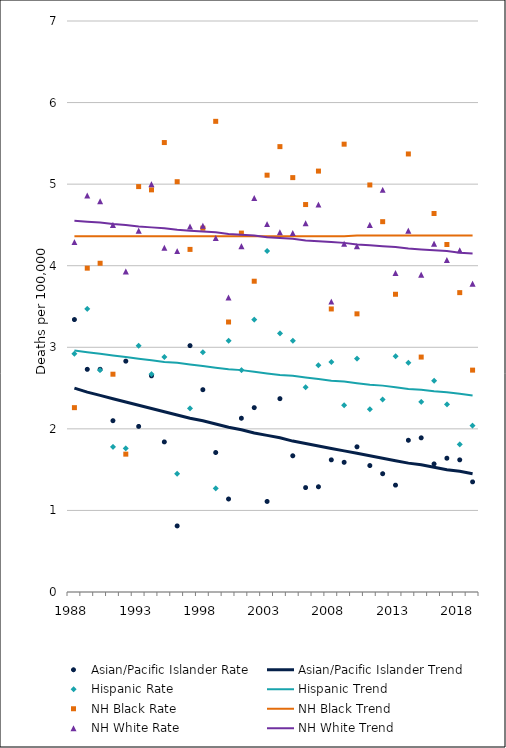
| Category | Asian/Pacific Islander Rate | Asian/Pacific Islander Trend | Hispanic Rate | Hispanic Trend | NH Black Rate | NH Black Trend | NH White Rate | NH White Trend |
|---|---|---|---|---|---|---|---|---|
| 1988.0 | 3.34 | 2.5 | 2.92 | 2.96 | 2.26 | 4.36 | 4.29 | 4.55 |
| 1989.0 | 2.73 | 2.45 | 3.47 | 2.94 | 3.97 | 4.36 | 4.86 | 4.54 |
| 1990.0 | 2.73 | 2.41 | 2.72 | 2.92 | 4.03 | 4.36 | 4.79 | 4.53 |
| 1991.0 | 2.1 | 2.37 | 1.78 | 2.9 | 2.67 | 4.36 | 4.5 | 4.51 |
| 1992.0 | 2.83 | 2.33 | 1.76 | 2.88 | 1.69 | 4.36 | 3.93 | 4.5 |
| 1993.0 | 2.03 | 2.29 | 3.02 | 2.86 | 4.97 | 4.36 | 4.43 | 4.48 |
| 1994.0 | 2.65 | 2.25 | 2.67 | 2.84 | 4.93 | 4.36 | 5 | 4.47 |
| 1995.0 | 1.84 | 2.21 | 2.88 | 2.82 | 5.51 | 4.36 | 4.22 | 4.46 |
| 1996.0 | 0.81 | 2.17 | 1.45 | 2.81 | 5.03 | 4.36 | 4.18 | 4.44 |
| 1997.0 | 3.02 | 2.13 | 2.25 | 2.79 | 4.2 | 4.36 | 4.48 | 4.43 |
| 1998.0 | 2.48 | 2.1 | 2.94 | 2.77 | 4.46 | 4.36 | 4.49 | 4.42 |
| 1999.0 | 1.71 | 2.06 | 1.27 | 2.75 | 5.77 | 4.36 | 4.34 | 4.41 |
| 2000.0 | 1.14 | 2.02 | 3.08 | 2.73 | 3.31 | 4.36 | 3.61 | 4.39 |
| 2001.0 | 2.13 | 1.99 | 2.72 | 2.72 | 4.4 | 4.36 | 4.24 | 4.38 |
| 2002.0 | 2.26 | 1.95 | 3.34 | 2.7 | 3.81 | 4.36 | 4.83 | 4.37 |
| 2003.0 | 1.11 | 1.92 | 4.18 | 2.68 | 5.11 | 4.36 | 4.51 | 4.35 |
| 2004.0 | 2.37 | 1.89 | 3.17 | 2.66 | 5.46 | 4.36 | 4.41 | 4.34 |
| 2005.0 | 1.67 | 1.85 | 3.08 | 2.65 | 5.08 | 4.36 | 4.4 | 4.33 |
| 2006.0 | 1.28 | 1.82 | 2.51 | 2.63 | 4.75 | 4.36 | 4.52 | 4.31 |
| 2007.0 | 1.29 | 1.79 | 2.78 | 2.61 | 5.16 | 4.36 | 4.75 | 4.3 |
| 2008.0 | 1.62 | 1.76 | 2.82 | 2.59 | 3.47 | 4.36 | 3.56 | 4.29 |
| 2009.0 | 1.59 | 1.73 | 2.29 | 2.58 | 5.49 | 4.36 | 4.27 | 4.28 |
| 2010.0 | 1.78 | 1.7 | 2.86 | 2.56 | 3.41 | 4.37 | 4.24 | 4.26 |
| 2011.0 | 1.55 | 1.67 | 2.24 | 2.54 | 4.99 | 4.37 | 4.5 | 4.25 |
| 2012.0 | 1.45 | 1.64 | 2.36 | 2.53 | 4.54 | 4.37 | 4.93 | 4.24 |
| 2013.0 | 1.31 | 1.61 | 2.89 | 2.51 | 3.65 | 4.37 | 3.91 | 4.23 |
| 2014.0 | 1.86 | 1.58 | 2.81 | 2.49 | 5.37 | 4.37 | 4.43 | 4.21 |
| 2015.0 | 1.89 | 1.56 | 2.33 | 2.48 | 2.88 | 4.37 | 3.89 | 4.2 |
| 2016.0 | 1.57 | 1.53 | 2.59 | 2.46 | 4.64 | 4.37 | 4.27 | 4.19 |
| 2017.0 | 1.64 | 1.5 | 2.3 | 2.45 | 4.26 | 4.37 | 4.07 | 4.18 |
| 2018.0 | 1.62 | 1.48 | 1.81 | 2.43 | 3.67 | 4.37 | 4.19 | 4.16 |
| 2019.0 | 1.35 | 1.45 | 2.04 | 2.41 | 2.72 | 4.37 | 3.78 | 4.15 |